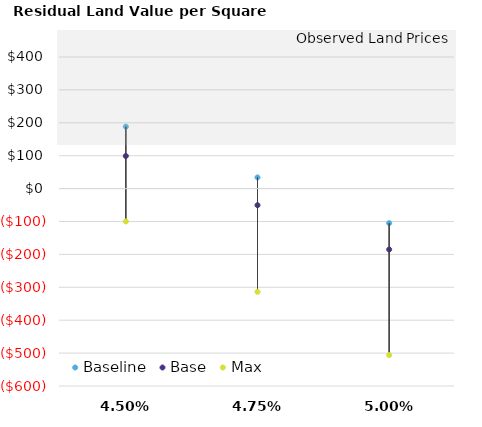
| Category | Baseline | Base | Max |
|---|---|---|---|
| 0.045 | 188.235 | 99.057 | -99.837 |
| 0.0475 | 33.975 | -50.51 | -313.613 |
| 0.05 | -104.86 | -185.12 | -506.012 |